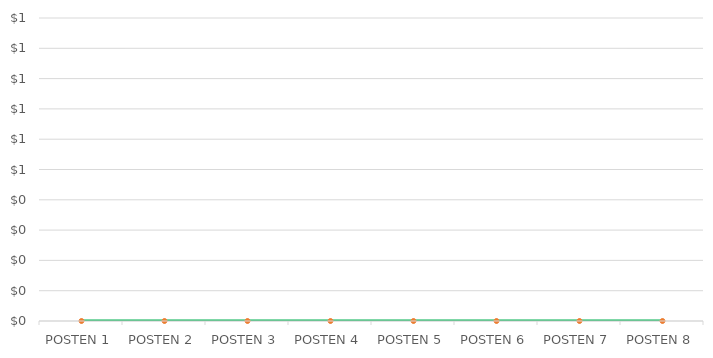
| Category | Series 1 |
|---|---|
| POSTEN 1 | 0 |
| POSTEN 2 | 0 |
| POSTEN 3 | 0 |
| POSTEN 4 | 0 |
| POSTEN 5 | 0 |
| POSTEN 6 | 0 |
| POSTEN 7 | 0 |
| POSTEN 8 | 0 |